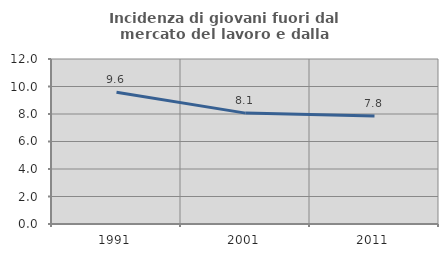
| Category | Incidenza di giovani fuori dal mercato del lavoro e dalla formazione  |
|---|---|
| 1991.0 | 9.581 |
| 2001.0 | 8.065 |
| 2011.0 | 7.849 |